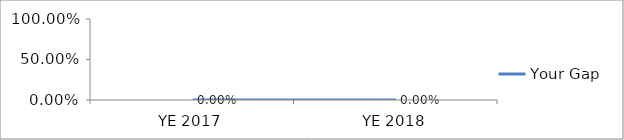
| Category | Your Gap |
|---|---|
| YE 2017 | 0 |
| YE 2018 | 0 |